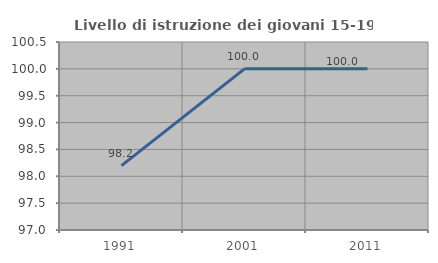
| Category | Livello di istruzione dei giovani 15-19 anni |
|---|---|
| 1991.0 | 98.198 |
| 2001.0 | 100 |
| 2011.0 | 100 |